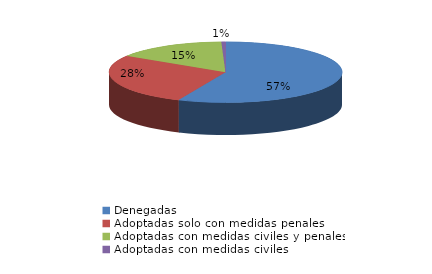
| Category | Series 0 |
|---|---|
| Denegadas | 298 |
| Adoptadas solo con medidas penales | 145 |
| Adoptadas con medidas civiles y penales | 81 |
| Adoptadas con medidas civiles | 3 |